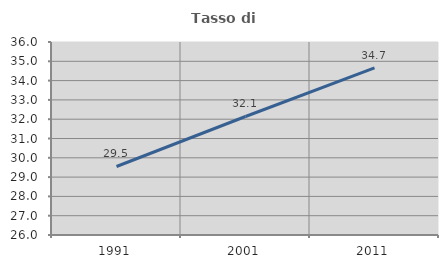
| Category | Tasso di occupazione   |
|---|---|
| 1991.0 | 29.549 |
| 2001.0 | 32.14 |
| 2011.0 | 34.658 |